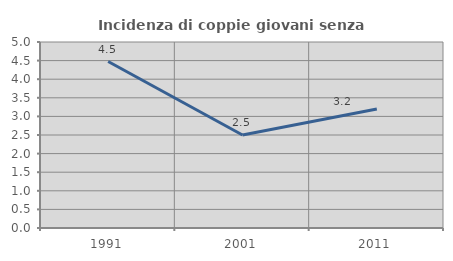
| Category | Incidenza di coppie giovani senza figli |
|---|---|
| 1991.0 | 4.474 |
| 2001.0 | 2.5 |
| 2011.0 | 3.2 |